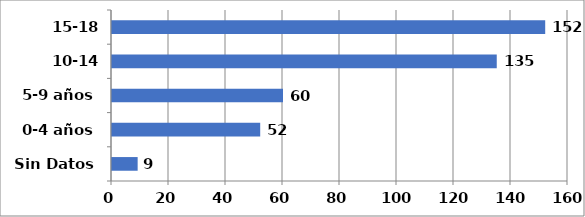
| Category | Series 0 |
|---|---|
| Sin Datos | 9 |
| 0-4 años | 52 |
| 5-9 años | 60 |
| 10-14 años | 135 |
| 15-18 años | 152 |